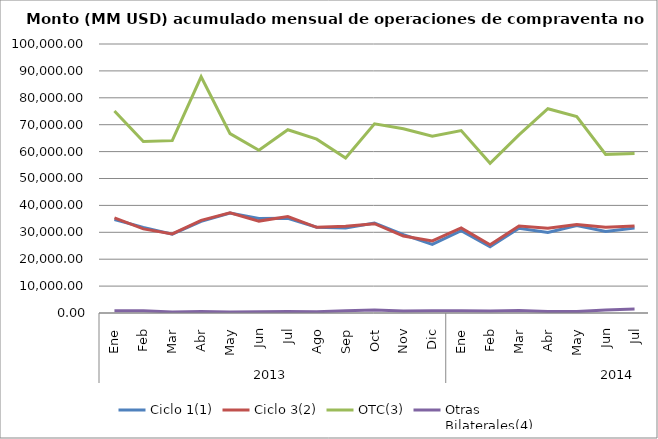
| Category | Ciclo 1(1) | Ciclo 3(2) | OTC(3) | Otras
Bilaterales(4) |
|---|---|---|---|---|
| 0 | 34736.674 | 35336.778 | 75100.994 | 862.558 |
| 1 | 31837.301 | 31276.084 | 63735.014 | 835.426 |
| 2 | 29308.645 | 29417.861 | 64070.642 | 371.583 |
| 3 | 34083.554 | 34428.23 | 87796.406 | 540.738 |
| 4 | 37163.38 | 37242.543 | 66687.424 | 368.797 |
| 5 | 35163.266 | 34165.361 | 60467.987 | 473.52 |
| 6 | 35197.057 | 35828.881 | 68121.887 | 537.978 |
| 7 | 31913.776 | 31846.832 | 64630.867 | 477.656 |
| 8 | 31601.855 | 32260.646 | 57599.123 | 864.94 |
| 9 | 33455.872 | 33201.092 | 70316.044 | 1074.052 |
| 10 | 29141.89 | 28620.849 | 68482.193 | 758.559 |
| 11 | 25532.796 | 26816.016 | 65678.317 | 842.072 |
| 12 | 30609.998 | 31608.391 | 67807.808 | 838.473 |
| 13 | 24661.445 | 25355.64 | 55646.165 | 717.558 |
| 14 | 31490.456 | 32327.003 | 66188.016 | 905.778 |
| 15 | 29968.466 | 31511.409 | 75953.393 | 552.114 |
| 16 | 32511.8 | 32893.552 | 73041.006 | 512.251 |
| 17 | 30347.815 | 31837.962 | 58974.75 | 1157.814 |
| 18 | 31634.299 | 32380.251 | 59280.214 | 1471.651 |